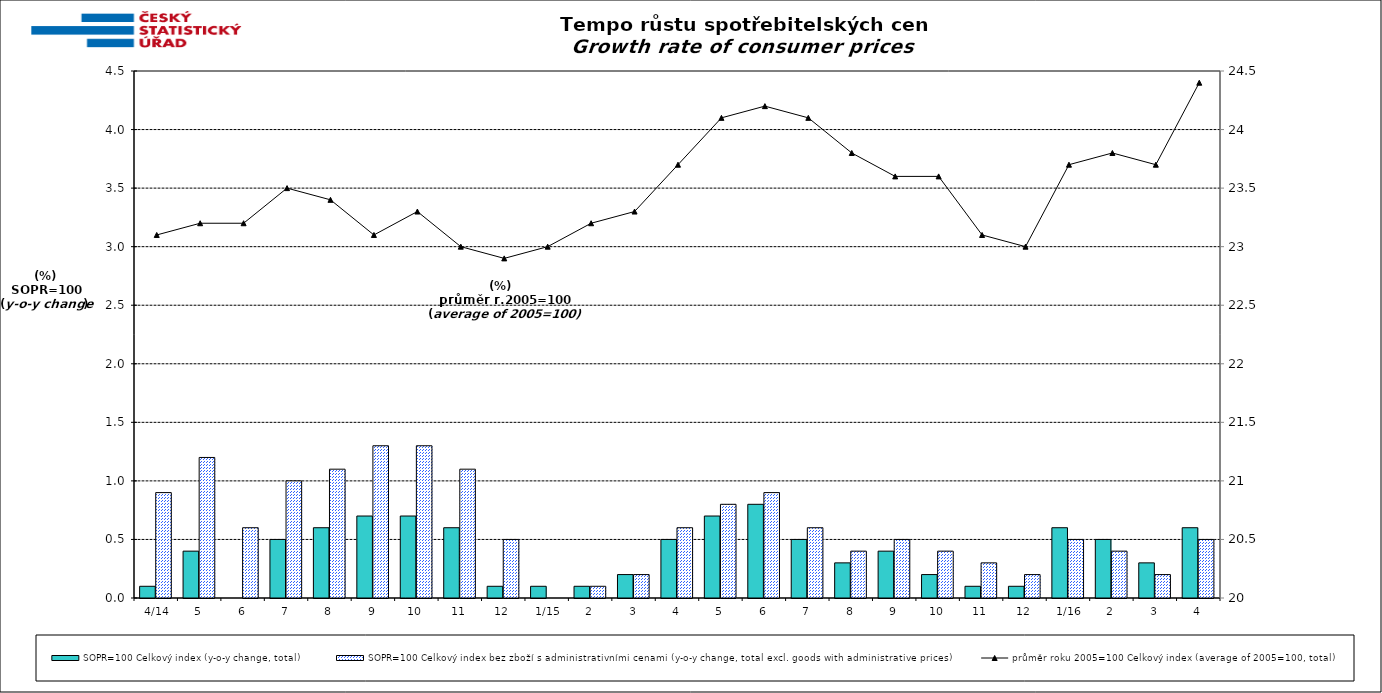
| Category | SOPR=100 Celkový index (y-o-y change, total) | SOPR=100 Celkový index bez zboží s administrativními cenami (y-o-y change, total excl. goods with administrative prices)  |
|---|---|---|
|  4/14 | 0.1 | 0.9 |
| 5 | 0.4 | 1.2 |
| 6 | 0 | 0.6 |
| 7 | 0.5 | 1 |
| 8 | 0.6 | 1.1 |
| 9 | 0.7 | 1.3 |
| 10 | 0.7 | 1.3 |
| 11 | 0.6 | 1.1 |
| 12 | 0.1 | 0.5 |
|  1/15 | 0.1 | 0 |
| 2 | 0.1 | 0.1 |
| 3 | 0.2 | 0.2 |
| 4 | 0.5 | 0.6 |
| 5 | 0.7 | 0.8 |
| 6 | 0.8 | 0.9 |
| 7 | 0.5 | 0.6 |
| 8 | 0.3 | 0.4 |
| 9 | 0.4 | 0.5 |
| 10 | 0.2 | 0.4 |
| 11 | 0.1 | 0.3 |
| 12 | 0.1 | 0.2 |
|  1/16 | 0.6 | 0.5 |
| 2 | 0.5 | 0.4 |
| 3 | 0.3 | 0.2 |
| 4 | 0.6 | 0.5 |